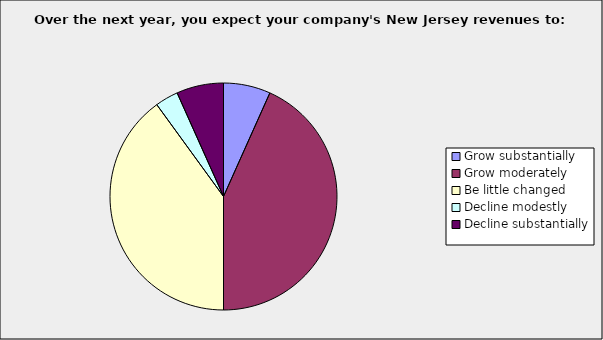
| Category | Series 0 |
|---|---|
| Grow substantially | 0.067 |
| Grow moderately | 0.433 |
| Be little changed | 0.4 |
| Decline modestly | 0.033 |
| Decline substantially | 0.067 |